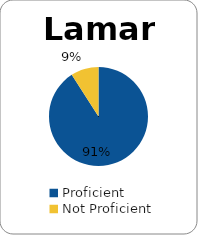
| Category | Series 0 |
|---|---|
| Proficient | 0.909 |
| Not Proficient | 0.091 |